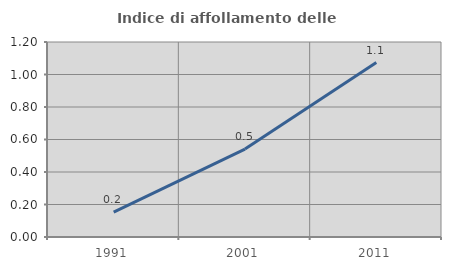
| Category | Indice di affollamento delle abitazioni  |
|---|---|
| 1991.0 | 0.153 |
| 2001.0 | 0.541 |
| 2011.0 | 1.074 |